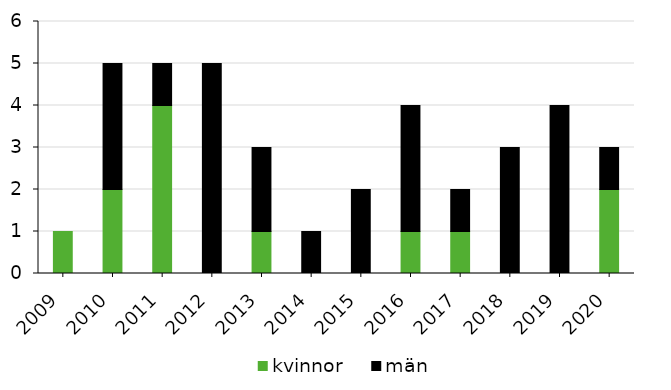
| Category | kvinnor | män |
|---|---|---|
| 2009 | 1 | 0 |
| 2010 | 2 | 3 |
| 2011 | 4 | 1 |
| 2012 | 0 | 5 |
| 2013 | 1 | 2 |
| 2014 | 0 | 1 |
| 2015 | 0 | 2 |
| 2016 | 1 | 3 |
| 2017 | 1 | 1 |
| 2018 | 0 | 3 |
| 2019 | 0 | 4 |
| 2020 | 2 | 1 |